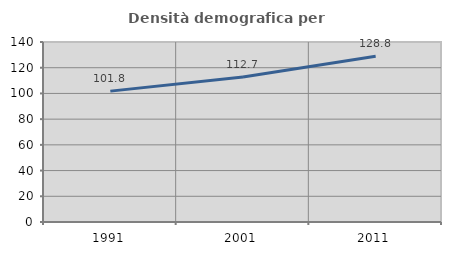
| Category | Densità demografica |
|---|---|
| 1991.0 | 101.787 |
| 2001.0 | 112.72 |
| 2011.0 | 128.84 |